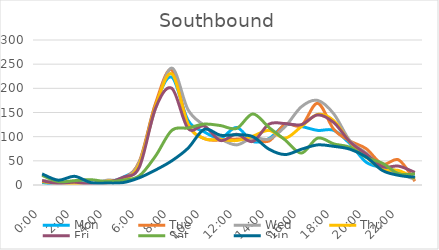
| Category | Mon | Tue | Wed | Thu | Fri | Sat | Sun |
|---|---|---|---|---|---|---|---|
| 0.0 | 5 | 9 | 9 | 7 | 9 | 20 | 23 |
| 0.041667 | 1 | 5 | 5 | 3 | 3 | 7 | 10 |
| 0.083333 | 6 | 5 | 1 | 1 | 6 | 9 | 18 |
| 0.125 | 3 | 1 | 2 | 2 | 1 | 11 | 5 |
| 0.166667 | 6 | 4 | 10 | 8 | 5 | 7 | 4 |
| 0.208333 | 16 | 13 | 12 | 11 | 16 | 10 | 5 |
| 0.25 | 46 | 49 | 47 | 43 | 37 | 19 | 15 |
| 0.291667 | 167 | 169 | 159 | 163 | 159 | 60 | 31 |
| 0.333333 | 223 | 238 | 242 | 230 | 200 | 113 | 50 |
| 0.375 | 134 | 126 | 156 | 126 | 117 | 118 | 76 |
| 0.416667 | 110 | 96 | 123 | 96 | 122 | 126 | 115 |
| 0.458333 | 97 | 93 | 96 | 94 | 92 | 123 | 103 |
| 0.5 | 119 | 95 | 83 | 92 | 105 | 117 | 104 |
| 0.541667 | 90 | 95 | 98 | 101 | 90 | 147 | 100 |
| 0.5833333333333334 | 96 | 91 | 95 | 113 | 126 | 119 | 74 |
| 0.625 | 124 | 126 | 121 | 97 | 127 | 93 | 63 |
| 0.666667 | 121 | 123 | 162 | 121 | 125 | 66 | 74 |
| 0.708333 | 113 | 169 | 175 | 146 | 145 | 97 | 83 |
| 0.75 | 113 | 115 | 147 | 133 | 129 | 85 | 80 |
| 0.791667 | 85 | 91 | 91 | 88 | 89 | 78 | 74 |
| 0.833333 | 47 | 75 | 66 | 58 | 64 | 57 | 58 |
| 0.875 | 36 | 43 | 34 | 32 | 38 | 45 | 30 |
| 0.916667 | 28 | 52 | 23 | 30 | 39 | 23 | 20 |
| 0.958333 | 15 | 8 | 12 | 13 | 26 | 23 | 16 |